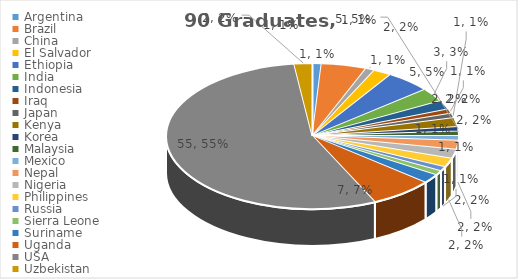
| Category | Graduates |
|---|---|
| Argentina | 1 |
| Brazil | 5 |
| China | 1 |
| El Salvador | 2 |
| Ethiopia | 5 |
| India | 3 |
| Indonesia | 2 |
| Iraq | 1 |
| Japan | 1 |
| Kenya | 2 |
| Korea | 1 |
| Malaysia | 1 |
| Mexico | 1 |
| Nepal | 2 |
| Nigeria | 2 |
| Philippines | 2 |
| Russia | 1 |
| Sierra Leone | 1 |
| Suriname | 2 |
| Uganda | 7 |
| USA | 55 |
| Uzbekistan | 2 |